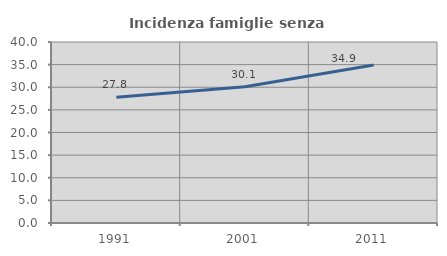
| Category | Incidenza famiglie senza nuclei |
|---|---|
| 1991.0 | 27.769 |
| 2001.0 | 30.111 |
| 2011.0 | 34.897 |